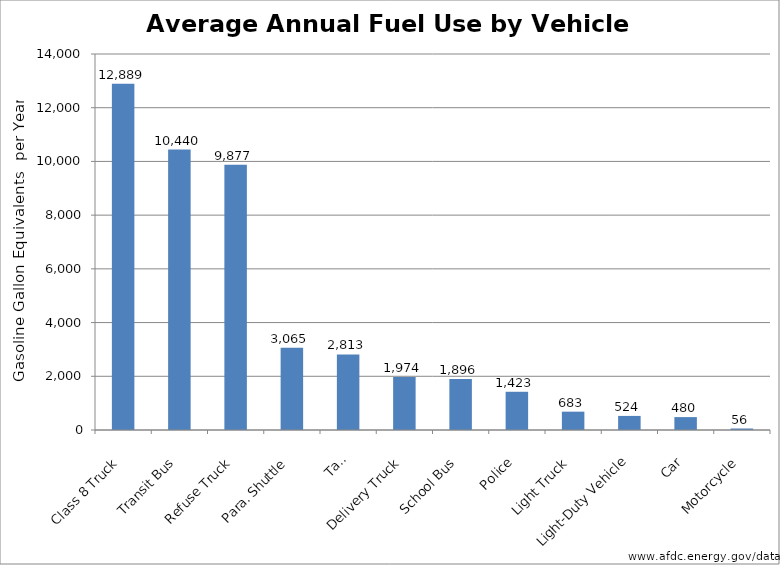
| Category | Series 0 |
|---|---|
| Class 8 Truck | 12888.821 |
| Transit Bus | 10439.607 |
| Refuse Truck | 9876.738 |
| Para. Shuttle | 3065.028 |
| Taxi | 2813.296 |
| Delivery Truck | 1974.154 |
| School Bus | 1896.334 |
| Police | 1423.474 |
| Light Truck | 682.524 |
| Light-Duty Vehicle | 524.425 |
| Car | 480.283 |
| Motorcycle | 55.649 |